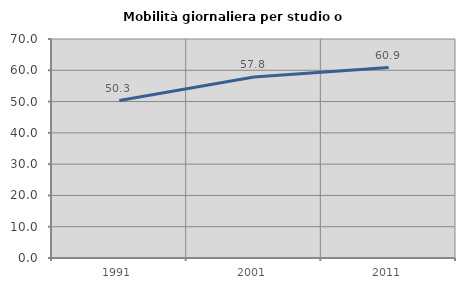
| Category | Mobilità giornaliera per studio o lavoro |
|---|---|
| 1991.0 | 50.336 |
| 2001.0 | 57.823 |
| 2011.0 | 60.881 |